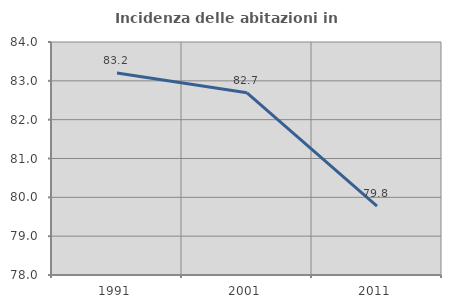
| Category | Incidenza delle abitazioni in proprietà  |
|---|---|
| 1991.0 | 83.2 |
| 2001.0 | 82.692 |
| 2011.0 | 79.771 |